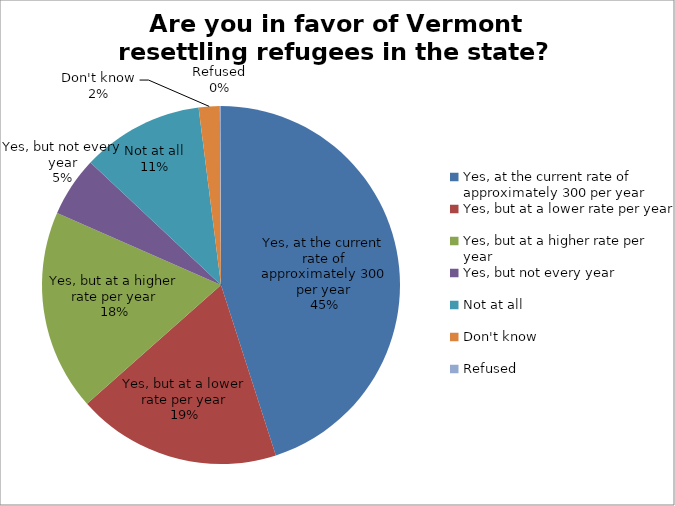
| Category | Valid Percent | Percent | Frequency |
|---|---|---|---|
| Yes, at the current rate of approximately 300 per year | 45 | 45 | 289 |
| Yes, but at a lower rate per year | 18.4 | 18.4 | 118 |
| Yes, but at a higher rate per year | 18.1 | 18.1 | 116 |
| Yes, but not every year | 5.4 | 9.9 | 34 |
| Not at all | 11 | 11.1 | 71 |
| Don't know | 1.9 | 1.9 | 12 |
| Refused | 0.1 | 0.2 | 1 |